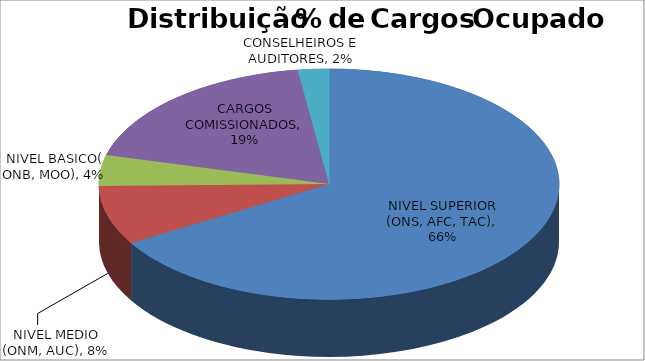
| Category | Series 0 |
|---|---|
| NIVEL SUPERIOR (ONS, AFC, TAC) | 0.664 |
| NIVEL MEDIO (ONM, AUC) | 0.083 |
| NIVEL BASICO( ONB, MOO) | 0.044 |
| CARGOS COMISSIONADOS | 0.187 |
| CONSELHEIROS E AUDITORES | 0.022 |